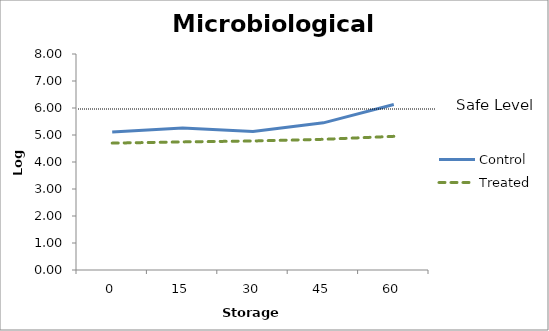
| Category | Control | Treated |
|---|---|---|
| 0 | 5.114 | 4.699 |
| 1 | 5.255 | 4.744 |
| 2 | 5.132 | 4.778 |
| 3 | 5.45 | 4.84 |
| 4 | 6.13 | 4.95 |